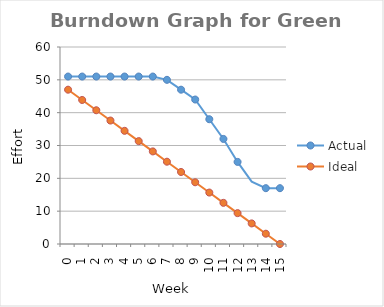
| Category | Actual | Ideal |
|---|---|---|
| 0 | 51 | 47 |
| 1 | 51 | 43.867 |
| 2 | 51 | 40.733 |
| 3 | 51 | 37.6 |
| 4 | 51 | 34.467 |
| 5 | 51 | 31.333 |
| 6 | 51 | 28.2 |
| 7 | 50 | 25.067 |
| 8 | 47 | 21.933 |
| 9 | 44 | 18.8 |
| 10 | 38 | 15.667 |
| 11 | 32 | 12.533 |
| 12 | 25 | 9.4 |
| 13 | 19 | 6.267 |
| 14 | 17 | 3.133 |
| 15 | 17 | 0 |